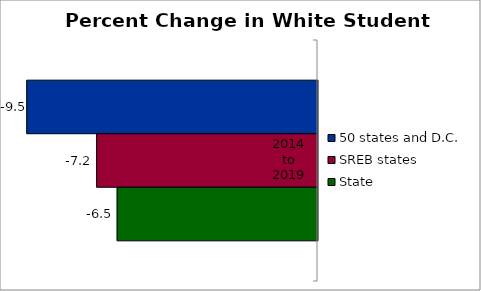
| Category | 50 states and D.C. | SREB states | State |
|---|---|---|---|
| 2014 to 2019 | -9.469 | -7.193 | -6.526 |